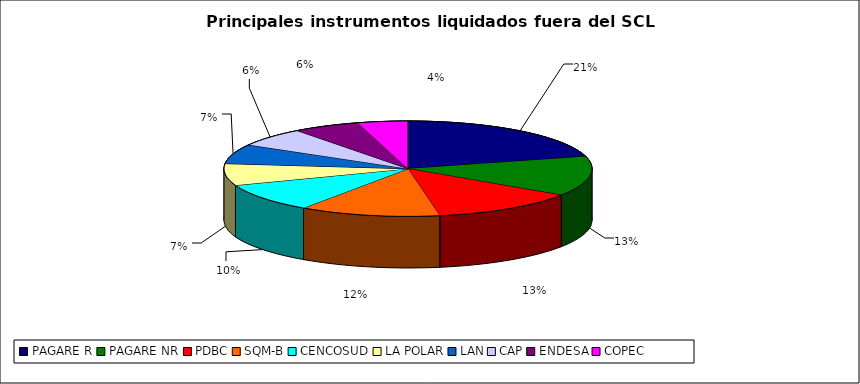
| Category | Series 0 |
|---|---|
| PAGARE R | 1879 |
| PAGARE NR | 1217 |
| PDBC | 1163 |
| SQM-B | 1115 |
| CENCOSUD | 878 |
| LA POLAR | 664 |
| LAN | 597 |
| CAP | 576 |
| ENDESA | 528 |
| COPEC | 399 |